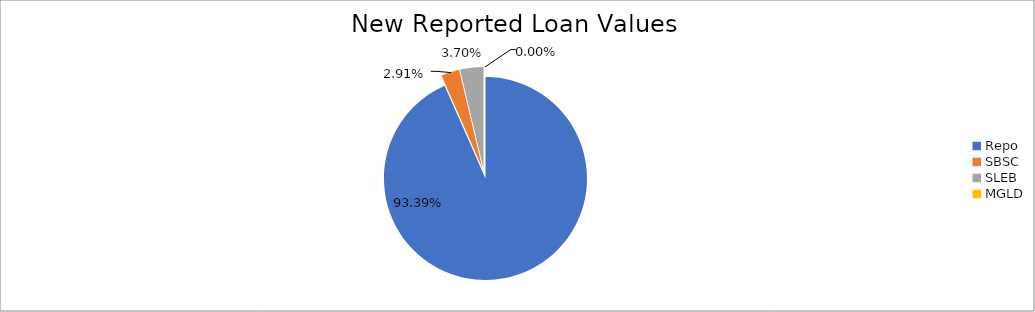
| Category | Series 0 |
|---|---|
| Repo | 9473785.572 |
| SBSC | 295111.456 |
| SLEB | 375382.234 |
| MGLD | 165.312 |